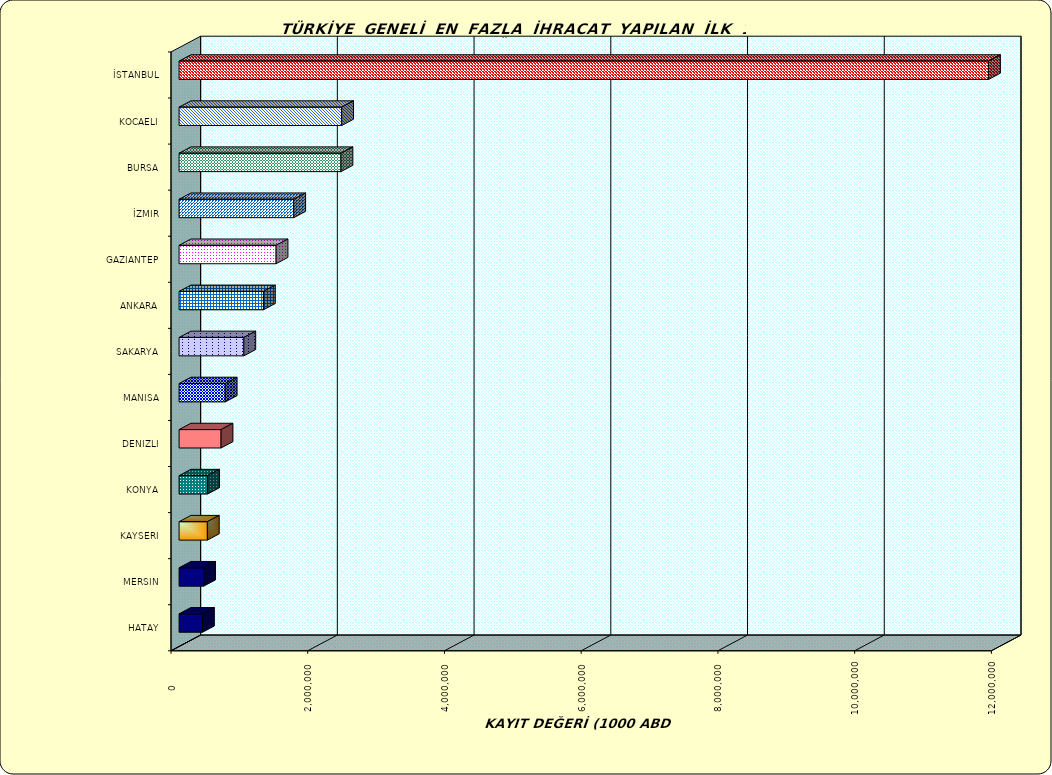
| Category | Series 0 |
|---|---|
| İSTANBUL | 11840070.099 |
| KOCAELI | 2378415.521 |
| BURSA | 2368426.506 |
| İZMIR | 1677426.58 |
| GAZIANTEP | 1419105.053 |
| ANKARA | 1234350.442 |
| SAKARYA | 947393.107 |
| MANISA | 675461.412 |
| DENIZLI | 614118.609 |
| KONYA | 416895.203 |
| KAYSERI | 413857.418 |
| MERSIN | 359795.483 |
| HATAY | 342849.816 |